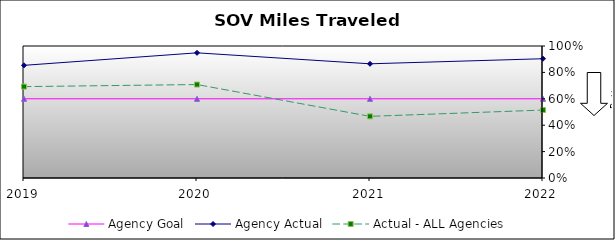
| Category | Agency Goal | Agency Actual | Actual - ALL Agencies |
|---|---|---|---|
| 2019.0 | 0.6 | 0.854 | 0.692 |
| 2020.0 | 0.6 | 0.948 | 0.708 |
| 2021.0 | 0.6 | 0.865 | 0.467 |
| 2022.0 | 0.6 | 0.904 | 0.515 |